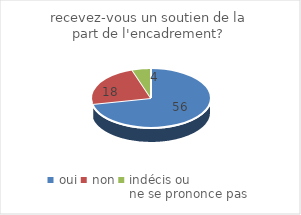
| Category | recevez-vous un soutien de la part de l'encadrement? |
|---|---|
| oui | 56 |
| non | 18 |
| indécis ou 
ne se prononce pas | 4 |